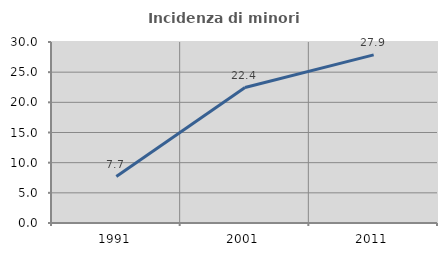
| Category | Incidenza di minori stranieri |
|---|---|
| 1991.0 | 7.692 |
| 2001.0 | 22.449 |
| 2011.0 | 27.872 |